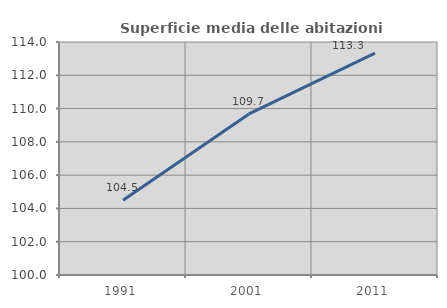
| Category | Superficie media delle abitazioni occupate |
|---|---|
| 1991.0 | 104.494 |
| 2001.0 | 109.678 |
| 2011.0 | 113.333 |